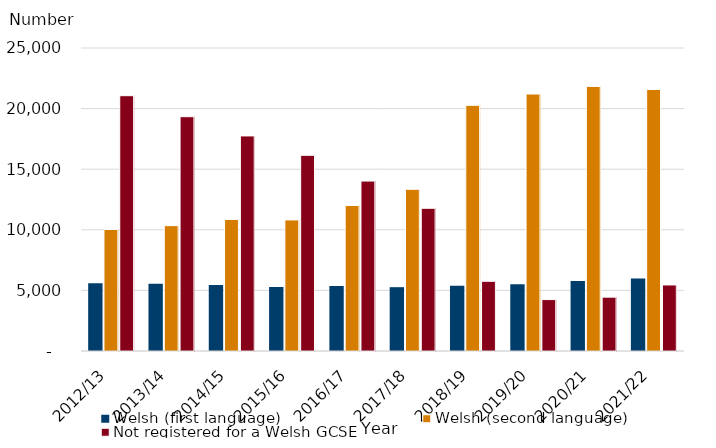
| Category | Welsh (first language) | Welsh (second language) | Not registered for a Welsh GCSE |
|---|---|---|---|
| 2012/13 | 5580 | 10024 | 21065 |
| 2013/14 | 5541 | 10343 | 19332 |
| 2014/15 | 5444 | 10855 | 17745 |
| 2015/16 | 5285 | 10816 | 16147 |
| 2016/17 | 5365 | 12009 | 14020 |
| 2017/18 | 5266 | 13342 | 11774 |
| 2018/19 | 5385 | 20270 | 5750 |
| 2019/20 | 5515 | 21203 | 4242 |
| 2020/21 | 5782 | 21829 | 4442 |
| 2021/22 | 5972 | 21580 | 5449 |